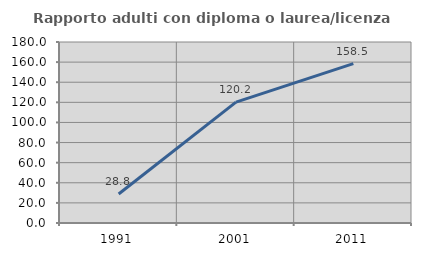
| Category | Rapporto adulti con diploma o laurea/licenza media  |
|---|---|
| 1991.0 | 28.846 |
| 2001.0 | 120.202 |
| 2011.0 | 158.537 |